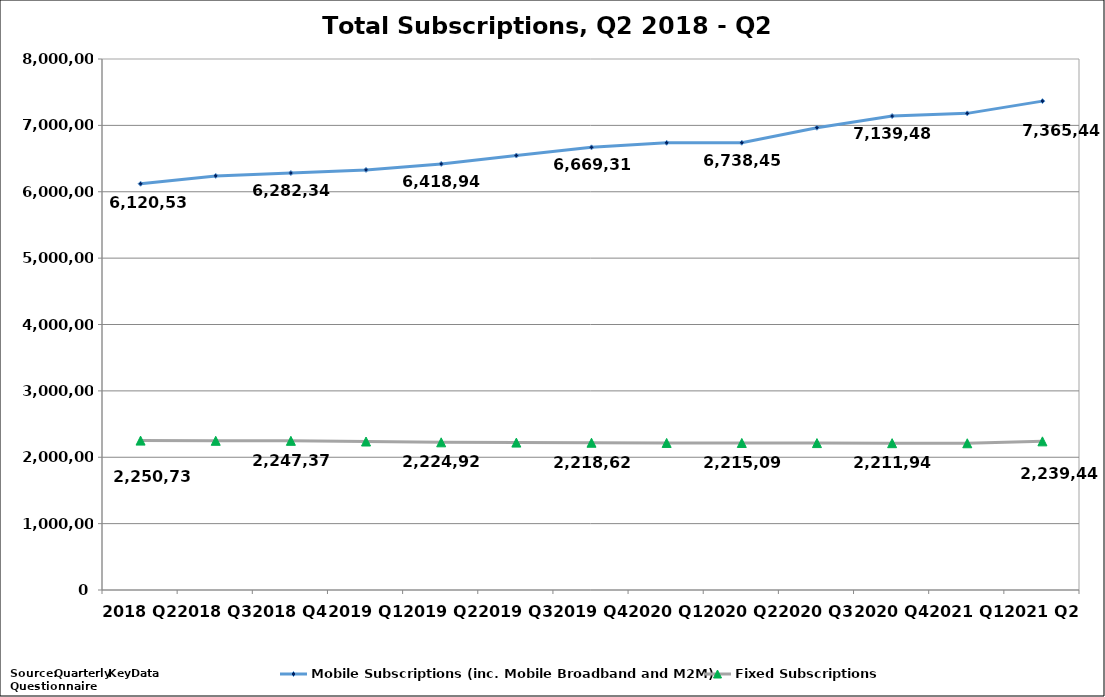
| Category | Mobile Subscriptions (inc. Mobile Broadband and M2M) | Fixed Subscriptions |
|---|---|---|
| 2018 Q2 | 6120535 | 2250735 |
| 2018 Q3 | 6238772 | 2247688 |
| 2018 Q4 | 6282346 | 2247375 |
| 2019 Q1 | 6329068 | 2237203 |
| 2019 Q2 | 6418948 | 2224921 |
| 2019 Q3 | 6545636 | 2221035 |
| 2019 Q4 | 6669317 | 2218622 |
| 2020 Q1 | 6737414 | 2215552 |
| 2020 Q2 | 6738457 | 2215092.885 |
| 2020 Q3 | 6964436 | 2213319 |
| 2020 Q4 | 7139486 | 2211940 |
| 2021 Q1 | 7181054 | 2210830 |
| 2021 Q2 | 7365441 | 2239441.42 |